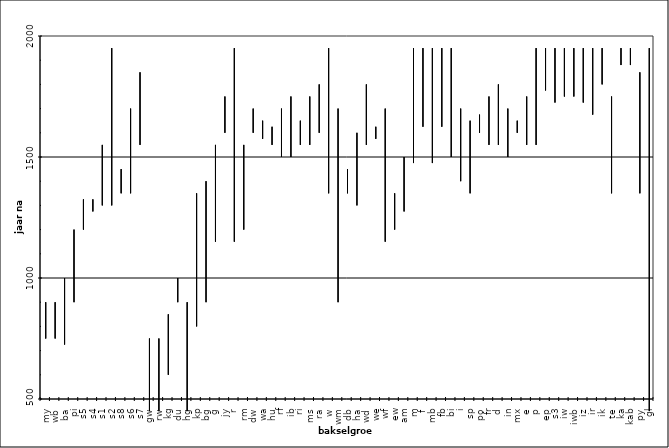
| Category | Reeks1 | Reeks2 | Reeks3 |
|---|---|---|---|
| my | 750 | 900 | 825 |
| wb | 750 | 900 | 825 |
| ba | 725 | 1000 | 862.5 |
| pi | 900 | 1200 | 1050 |
| s5 | 1200 | 1325 | 1262.5 |
| s4 | 1275 | 1325 | 1300 |
| s1 | 1300 | 1550 | 1425 |
| s2 | 1300 | 1950 | 1625 |
| s8 | 1350 | 1450 | 1400 |
| s6 | 1350 | 1700 | 1525 |
| s7 | 1550 | 1850 | 1700 |
| gw | 450 | 750 | 600 |
| rw | 450 | 750 | 600 |
| kg | 600 | 850 | 725 |
| du | 900 | 1000 | 950 |
| hg | 450 | 900 | 675 |
| kp | 800 | 1350 | 1075 |
| bg | 900 | 1400 | 1150 |
| g | 1150 | 1550 | 1350 |
| jy | 1600 | 1750 | 1675 |
| r | 1150 | 1950 | 1550 |
| rm | 1200 | 1550 | 1375 |
| dw | 1600 | 1700 | 1650 |
| wa | 1575 | 1650 | 1612.5 |
| hu | 1550 | 1625 | 1587.5 |
| rf | 1500 | 1700 | 1600 |
| ib | 1500 | 1750 | 1625 |
| ri | 1550 | 1650 | 1600 |
| ms | 1550 | 1750 | 1650 |
| ra | 1600 | 1800 | 1700 |
| w | 1350 | 1950 | 1650 |
| wm | 900 | 1700 | 1300 |
| db | 1350 | 1450 | 1400 |
| ha | 1300 | 1600 | 1450 |
| wd | 1550 | 1800 | 1675 |
| we | 1575 | 1625 | 1600 |
| wf | 1150 | 1700 | 1425 |
| ew | 1200 | 1350 | 1275 |
| am | 1275 | 1500 | 1387.5 |
| m | 1475 | 1950 | 1712.5 |
| f | 1625 | 1950 | 1787.5 |
| mb | 1475 | 1950 | 1712.5 |
| fb | 1625 | 1950 | 1787.5 |
| bi | 1500 | 1950 | 1725 |
| i | 1400 | 1700 | 1550 |
| sp | 1350 | 1650 | 1500 |
| po | 1600 | 1675 | 1637.5 |
| fr | 1550 | 1750 | 1650 |
| d | 1550 | 1800 | 1675 |
| in | 1500 | 1700 | 1600 |
| mx | 1600 | 1650 | 1625 |
| e | 1550 | 1750 | 1650 |
| p | 1550 | 1950 | 1750 |
| ep | 1775 | 1950 | 1862.5 |
| s3 | 1725 | 1950 | 1837.5 |
| iw | 1750 | 1950 | 1850 |
| iwb | 1750 | 1950 | 1850 |
| iz | 1725 | 1950 | 1837.5 |
| ir | 1675 | 1950 | 1812.5 |
| ik | 1800 | 1950 | 1875 |
| te | 1350 | 1750 | 1550 |
| ka | 1880 | 1950 | 1915 |
| kab | 1880 | 1950 | 1915 |
| py | 1350 | 1850 | 1600 |
| gl | 450 | 1950 | 1200 |